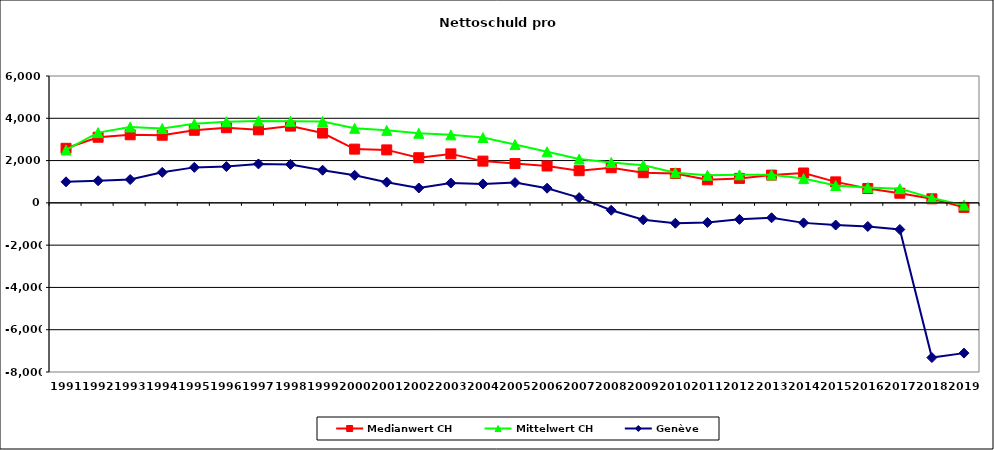
| Category | Medianwert CH | Mittelwert CH | Genève |
|---|---|---|---|
| 1991.0 | 2580 | 2501.231 | 995 |
| 1992.0 | 3103.5 | 3322.389 | 1045 |
| 1993.0 | 3220 | 3589 | 1102 |
| 1994.0 | 3199 | 3514.619 | 1443 |
| 1995.0 | 3433 | 3736.5 | 1678 |
| 1996.0 | 3553 | 3837.333 | 1716 |
| 1997.0 | 3453.5 | 3876.545 | 1841 |
| 1998.0 | 3630 | 3856.13 | 1819 |
| 1999.0 | 3302 | 3847.739 | 1544 |
| 2000.0 | 2542 | 3524.64 | 1305 |
| 2001.0 | 2505 | 3428.8 | 977 |
| 2002.0 | 2134 | 3290.4 | 703 |
| 2003.0 | 2316 | 3215.6 | 937 |
| 2004.0 | 1974 | 3090.325 | 895 |
| 2005.0 | 1858 | 2756.351 | 958 |
| 2006.0 | 1744.5 | 2416.426 | 694 |
| 2007.0 | 1520 | 2070.521 | 247 |
| 2008.0 | 1660 | 1907.634 | -351 |
| 2009.0 | 1426 | 1780.53 | -801.9 |
| 2010.0 | 1388.8 | 1427.327 | -963.2 |
| 2011.0 | 1091 | 1302.405 | -925.9 |
| 2012.0 | 1157.645 | 1326.071 | -780.6 |
| 2013.0 | 1313 | 1328.597 | -705.74 |
| 2014.0 | 1412.435 | 1147.291 | -947 |
| 2015.0 | 992 | 819.292 | -1049 |
| 2016.0 | 679 | 729.357 | -1118 |
| 2017.0 | 456.291 | 671.325 | -1260 |
| 2018.0 | 191 | 232.483 | -7317.9 |
| 2019.0 | -215 | -106.609 | -7107 |